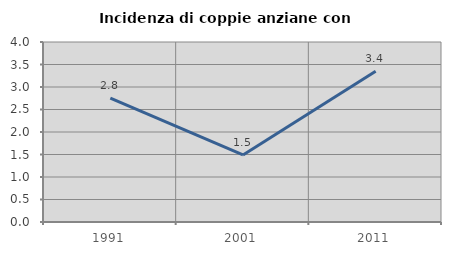
| Category | Incidenza di coppie anziane con figli |
|---|---|
| 1991.0 | 2.755 |
| 2001.0 | 1.49 |
| 2011.0 | 3.35 |